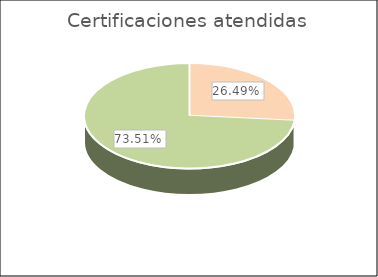
| Category | Certificaciones atendidas |
|---|---|
| Presencial | 0.265 |
| Página WEB | 0.735 |